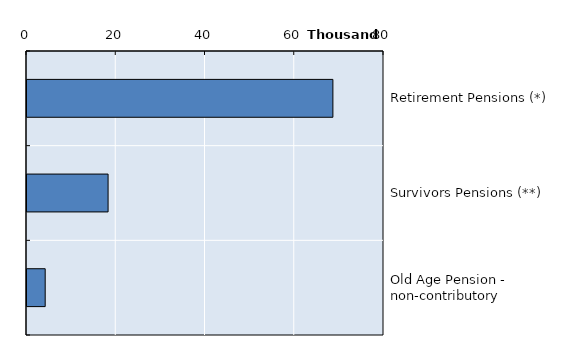
| Category | Series 0 |
|---|---|
| Retirement Pensions (*) | 68548 |
| Survivors Pensions (**) | 18171 |
| Old Age Pension - non-contributory | 4079 |